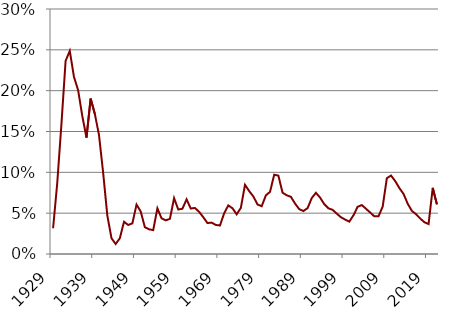
| Category | Series 0 |
|---|---|
| 1929.0 | 0.032 |
| 1930.0 | 0.087 |
| 1931.0 | 0.159 |
| 1932.0 | 0.236 |
| 1933.0 | 0.249 |
| 1934.0 | 0.217 |
| 1935.0 | 0.201 |
| 1936.0 | 0.169 |
| 1937.0 | 0.143 |
| 1938.0 | 0.19 |
| 1939.0 | 0.172 |
| 1940.0 | 0.146 |
| 1941.0 | 0.099 |
| 1942.0 | 0.047 |
| 1943.0 | 0.019 |
| 1944.0 | 0.012 |
| 1945.0 | 0.019 |
| 1946.0 | 0.039 |
| 1947.0 | 0.036 |
| 1948.0 | 0.038 |
| 1949.0 | 0.06 |
| 1950.0 | 0.052 |
| 1951.0 | 0.033 |
| 1952.0 | 0.03 |
| 1953.0 | 0.029 |
| 1954.0 | 0.056 |
| 1955.0 | 0.044 |
| 1956.0 | 0.041 |
| 1957.0 | 0.043 |
| 1958.0 | 0.068 |
| 1959.0 | 0.054 |
| 1960.0 | 0.055 |
| 1961.0 | 0.067 |
| 1962.0 | 0.056 |
| 1963.0 | 0.056 |
| 1964.0 | 0.052 |
| 1965.0 | 0.045 |
| 1966.0 | 0.038 |
| 1967.0 | 0.038 |
| 1968.0 | 0.036 |
| 1969.0 | 0.035 |
| 1970.0 | 0.05 |
| 1971.0 | 0.06 |
| 1972.0 | 0.056 |
| 1973.0 | 0.049 |
| 1974.0 | 0.056 |
| 1975.0 | 0.085 |
| 1976.0 | 0.077 |
| 1977.0 | 0.07 |
| 1978.0 | 0.061 |
| 1979.0 | 0.058 |
| 1980.0 | 0.072 |
| 1981.0 | 0.076 |
| 1982.0 | 0.097 |
| 1983.0 | 0.096 |
| 1984.0 | 0.075 |
| 1985.0 | 0.072 |
| 1986.0 | 0.07 |
| 1987.0 | 0.062 |
| 1988.0 | 0.055 |
| 1989.0 | 0.053 |
| 1990.0 | 0.056 |
| 1991.0 | 0.068 |
| 1992.0 | 0.075 |
| 1993.0 | 0.069 |
| 1994.0 | 0.061 |
| 1995.0 | 0.056 |
| 1996.0 | 0.054 |
| 1997.0 | 0.049 |
| 1998.0 | 0.045 |
| 1999.0 | 0.042 |
| 2000.0 | 0.04 |
| 2001.0 | 0.047 |
| 2002.0 | 0.058 |
| 2003.0 | 0.06 |
| 2004.0 | 0.055 |
| 2005.0 | 0.051 |
| 2006.0 | 0.046 |
| 2007.0 | 0.046 |
| 2008.0 | 0.058 |
| 2009.0 | 0.093 |
| 2010.0 | 0.096 |
| 2011.0 | 0.089 |
| 2012.0 | 0.081 |
| 2013.0 | 0.074 |
| 2014.0 | 0.062 |
| 2015.0 | 0.053 |
| 2016.0 | 0.049 |
| 2017.0 | 0.043 |
| 2018.0 | 0.039 |
| 2019.0 | 0.037 |
| 2020.0 | 0.081 |
| 2021.0 | 0.061 |